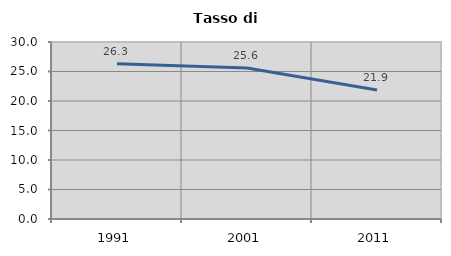
| Category | Tasso di disoccupazione   |
|---|---|
| 1991.0 | 26.298 |
| 2001.0 | 25.585 |
| 2011.0 | 21.88 |